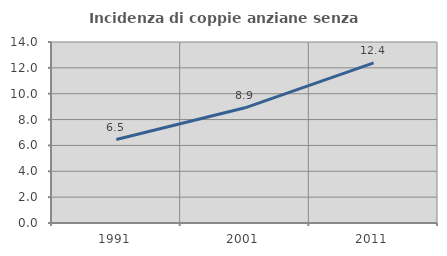
| Category | Incidenza di coppie anziane senza figli  |
|---|---|
| 1991.0 | 6.456 |
| 2001.0 | 8.91 |
| 2011.0 | 12.386 |